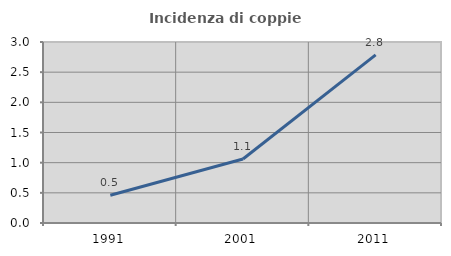
| Category | Incidenza di coppie miste |
|---|---|
| 1991.0 | 0.459 |
| 2001.0 | 1.06 |
| 2011.0 | 2.786 |